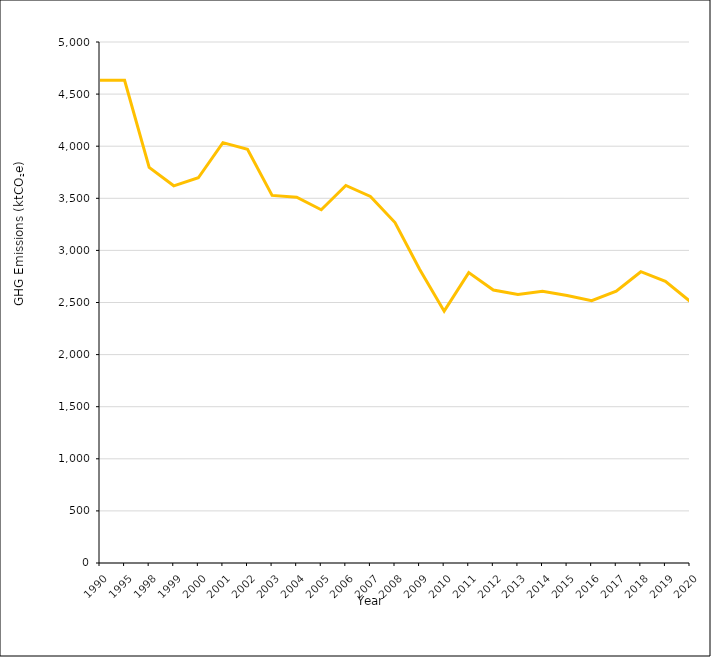
| Category | Emissions from manufacturing (ktCO₂e) |
|---|---|
| 1990 | 4631.866 |
| 1995 | 4631.866 |
| 1998 | 3795.887 |
| 1999 | 3619.718 |
| 2000 | 3697.075 |
| 2001 | 4033.91 |
| 2002 | 3970.135 |
| 2003 | 3528.013 |
| 2004 | 3510.782 |
| 2005 | 3389.72 |
| 2006 | 3622.835 |
| 2007 | 3517.543 |
| 2008 | 3267.499 |
| 2009 | 2820.028 |
| 2010 | 2416.969 |
| 2011 | 2786.976 |
| 2012 | 2620.336 |
| 2013 | 2576.923 |
| 2014 | 2608.1 |
| 2015 | 2567.371 |
| 2016 | 2517.159 |
| 2017 | 2609.496 |
| 2018 | 2795.543 |
| 2019 | 2703.639 |
| 2020 | 2511.587 |